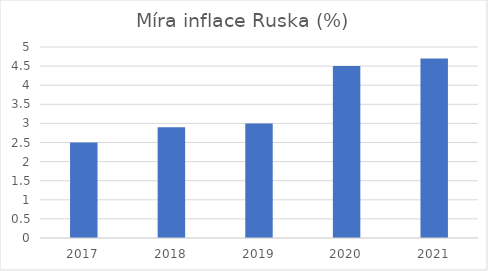
| Category | Míra inflace Ruska (%) |
|---|---|
| 2017.0 | 2.5 |
| 2018.0 | 2.9 |
| 2019.0 | 3 |
| 2020.0 | 4.5 |
| 2021.0 | 4.7 |